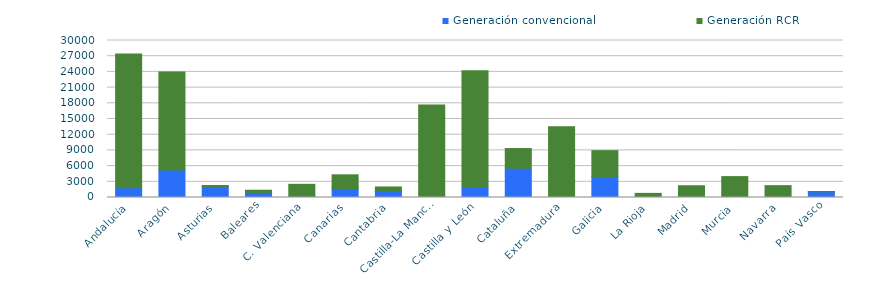
| Category | Generación convencional | Generación RCR |
|---|---|---|
| 0 | 1850.532 | 25567.459 |
| 1 | 5275.035 | 18710.296 |
| 2 | 2060.42 | 226.9 |
| 3 | 980.46 | 410.078 |
| 4 | 219.45 | 2296.36 |
| 5 | 1683.42 | 2650.34 |
| 6 | 1169.42 | 843.6 |
| 7 | 0 | 17669.982 |
| 8 | 1988.44 | 22235.916 |
| 9 | 5596.88 | 3756.52 |
| 10 | 0 | 13528.076 |
| 11 | 3943.32 | 5010.915 |
| 12 | 0 | 786.89 |
| 13 | 0 | 2245.81 |
| 14 | 0 | 3991.29 |
| 15 | 0 | 2265.755 |
| 16 | 1100 | 47 |